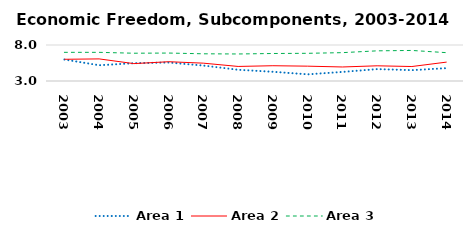
| Category | Area 1 | Area 2 | Area 3 |
|---|---|---|---|
| 2003.0 | 5.984 | 6.016 | 6.981 |
| 2004.0 | 5.19 | 6.07 | 6.98 |
| 2005.0 | 5.471 | 5.415 | 6.858 |
| 2006.0 | 5.568 | 5.678 | 6.882 |
| 2007.0 | 5.146 | 5.478 | 6.778 |
| 2008.0 | 4.558 | 5.022 | 6.754 |
| 2009.0 | 4.283 | 5.121 | 6.82 |
| 2010.0 | 3.925 | 5.061 | 6.846 |
| 2011.0 | 4.259 | 4.948 | 6.938 |
| 2012.0 | 4.651 | 5.111 | 7.188 |
| 2013.0 | 4.507 | 5.01 | 7.244 |
| 2014.0 | 4.784 | 5.624 | 6.935 |